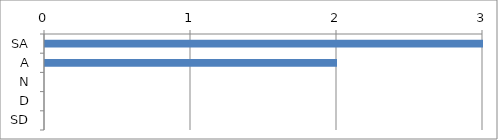
| Category | Series 0 |
|---|---|
| SA | 3 |
| A | 2 |
| N | 0 |
| D | 0 |
| SD | 0 |